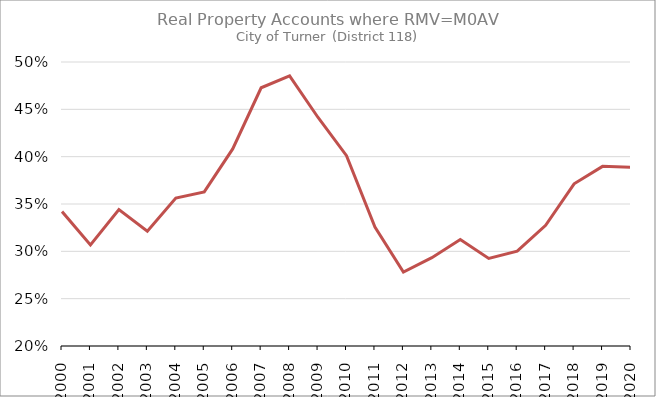
| Category | Series 0 |
|---|---|
| 2000.0 | 0.342 |
| 2001.0 | 0.307 |
| 2002.0 | 0.344 |
| 2003.0 | 0.321 |
| 2004.0 | 0.356 |
| 2005.0 | 0.363 |
| 2006.0 | 0.408 |
| 2007.0 | 0.473 |
| 2008.0 | 0.485 |
| 2009.0 | 0.441 |
| 2010.0 | 0.401 |
| 2011.0 | 0.326 |
| 2012.0 | 0.278 |
| 2013.0 | 0.293 |
| 2014.0 | 0.312 |
| 2015.0 | 0.292 |
| 2016.0 | 0.3 |
| 2017.0 | 0.327 |
| 2018.0 | 0.371 |
| 2019.0 | 0.39 |
| 2020.0 | 0.389 |